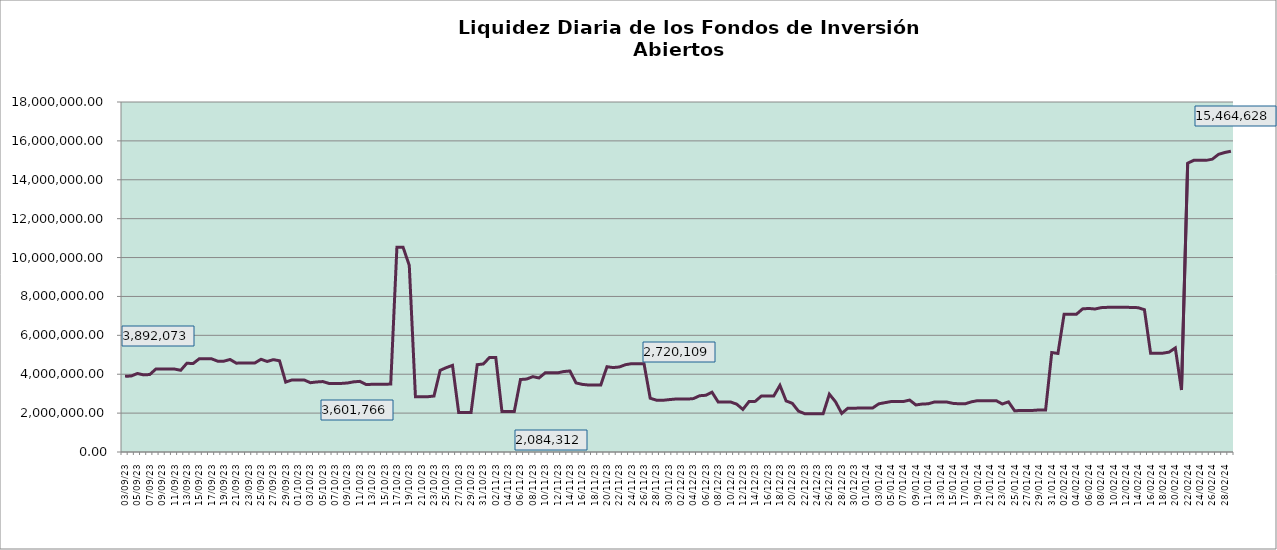
| Category | Liquidez |
|---|---|
| 2023-09-03 | 3892073.31 |
| 2023-09-04 | 3908903.28 |
| 2023-09-05 | 4036842.93 |
| 2023-09-06 | 3965911.15 |
| 2023-09-07 | 3984917.66 |
| 2023-09-08 | 4271911.78 |
| 2023-09-09 | 4271598.63 |
| 2023-09-10 | 4271285.58 |
| 2023-09-11 | 4265619.54 |
| 2023-09-12 | 4201445.83 |
| 2023-09-13 | 4564803.62 |
| 2023-09-14 | 4547943.86 |
| 2023-09-15 | 4793327.23 |
| 2023-09-16 | 4792917.57 |
| 2023-09-17 | 4792507.95 |
| 2023-09-18 | 4670390.41 |
| 2023-09-19 | 4672628.79 |
| 2023-09-20 | 4757974.91 |
| 2023-09-21 | 4568679.81 |
| 2023-09-22 | 4578069.45 |
| 2023-09-23 | 4577678.42 |
| 2023-09-24 | 4577287.46 |
| 2023-09-25 | 4768442.27 |
| 2023-09-26 | 4656041.24 |
| 2023-09-27 | 4749440.99 |
| 2023-09-28 | 4691215.04 |
| 2023-09-29 | 3594829.12 |
| 2023-09-30 | 3705131.39 |
| 2023-10-01 | 3704830.2 |
| 2023-10-02 | 3702299.07 |
| 2023-10-03 | 3563604.91 |
| 2023-10-04 | 3601766.17 |
| 2023-10-05 | 3622522.29 |
| 2023-10-06 | 3527179.42 |
| 2023-10-07 | 3526892.83 |
| 2023-10-08 | 3526606.27 |
| 2023-10-09 | 3549867.98 |
| 2023-10-10 | 3607916.07 |
| 2023-10-11 | 3632777.48 |
| 2023-10-12 | 3470821.4 |
| 2023-10-13 | 3480438.7 |
| 2023-10-14 | 3480170.23 |
| 2023-10-15 | 3479901.75 |
| 2023-10-16 | 3496944.65 |
| 2023-10-17 | 10529377.51 |
| 2023-10-18 | 10527427.59 |
| 2023-10-19 | 9598279.41 |
| 2023-10-20 | 2843795.49 |
| 2023-10-21 | 2843576.21 |
| 2023-10-22 | 2843356.97 |
| 2023-10-23 | 2877543.06 |
| 2023-10-24 | 4199796.46 |
| 2023-10-25 | 4339276.81 |
| 2023-10-26 | 4455991.46 |
| 2023-10-27 | 2029862.19 |
| 2023-10-28 | 2029705.75 |
| 2023-10-29 | 2029549.34 |
| 2023-10-30 | 4491312.09 |
| 2023-10-31 | 4528124.94 |
| 2023-11-01 | 4866315.82 |
| 2023-11-02 | 4865940.97 |
| 2023-11-03 | 2084311.74 |
| 2023-11-04 | 2084151.19 |
| 2023-11-05 | 2083990.68 |
| 2023-11-06 | 3727221.54 |
| 2023-11-07 | 3752037.55 |
| 2023-11-08 | 3875044.89 |
| 2023-11-09 | 3807636.9 |
| 2023-11-10 | 4070553.01 |
| 2023-11-11 | 4070322.09 |
| 2023-11-12 | 4070091.24 |
| 2023-11-13 | 4137469.64 |
| 2023-11-14 | 4166581.56 |
| 2023-11-15 | 3552454.63 |
| 2023-11-16 | 3478407.46 |
| 2023-11-17 | 3445309.06 |
| 2023-11-18 | 3445113.71 |
| 2023-11-19 | 3444918.35 |
| 2023-11-20 | 4386196.81 |
| 2023-11-21 | 4342385.83 |
| 2023-11-22 | 4372626.66 |
| 2023-11-23 | 4489820.31 |
| 2023-11-24 | 4544220.56 |
| 2023-11-25 | 4543962.98 |
| 2023-11-26 | 4543705.44 |
| 2023-11-27 | 2766288.53 |
| 2023-11-28 | 2665717.08 |
| 2023-11-29 | 2656380.27 |
| 2023-11-30 | 2691860.79 |
| 2023-12-01 | 2720262.81 |
| 2023-12-02 | 2720108.68 |
| 2023-12-03 | 2719954.59 |
| 2023-12-04 | 2746705.4 |
| 2023-12-05 | 2894133.5 |
| 2023-12-06 | 2916814.53 |
| 2023-12-07 | 3077187.61 |
| 2023-12-08 | 2573849.69 |
| 2023-12-09 | 2573703.91 |
| 2023-12-10 | 2573558.18 |
| 2023-12-11 | 2461459.62 |
| 2023-12-12 | 2190702.84 |
| 2023-12-13 | 2593963.56 |
| 2023-12-14 | 2603847 |
| 2023-12-15 | 2880624.68 |
| 2023-12-16 | 2880496.53 |
| 2023-12-17 | 2880368.4 |
| 2023-12-18 | 3427569.02 |
| 2023-12-19 | 2626945.09 |
| 2023-12-20 | 2503393.87 |
| 2023-12-21 | 2102165.32 |
| 2023-12-22 | 1971821.96 |
| 2023-12-23 | 1971734.3 |
| 2023-12-24 | 1971646.63 |
| 2023-12-25 | 1971558.94 |
| 2023-12-26 | 2974522.85 |
| 2023-12-27 | 2581700.12 |
| 2023-12-28 | 1984714.53 |
| 2023-12-29 | 2254994.88 |
| 2023-12-30 | 2254894.64 |
| 2023-12-31 | 2258082.15 |
| 2024-01-01 | 2257981.74 |
| 2024-01-02 | 2260561.99 |
| 2024-01-03 | 2476883.36 |
| 2024-01-04 | 2537478.87 |
| 2024-01-05 | 2594369.41 |
| 2024-01-06 | 2597486.32 |
| 2024-01-07 | 2597370.86 |
| 2024-01-08 | 2670959.38 |
| 2024-01-09 | 2420194.27 |
| 2024-01-10 | 2464449.75 |
| 2024-01-11 | 2479715.02 |
| 2024-01-12 | 2570593.12 |
| 2024-01-13 | 2570447.79 |
| 2024-01-14 | 2570302.43 |
| 2024-01-15 | 2501292.9 |
| 2024-01-16 | 2479569.79 |
| 2024-01-17 | 2480836.22 |
| 2024-01-18 | 2580722.87 |
| 2024-01-19 | 2641102.41 |
| 2024-01-20 | 2640953.13 |
| 2024-01-21 | 2640803.88 |
| 2024-01-22 | 2641058.29 |
| 2024-01-23 | 2469288.05 |
| 2024-01-24 | 2576946.84 |
| 2024-01-25 | 2116401.3 |
| 2024-01-26 | 2140122.93 |
| 2024-01-27 | 2140002.04 |
| 2024-01-28 | 2139881.12 |
| 2024-01-29 | 2162716.43 |
| 2024-01-30 | 2155182.85 |
| 2024-01-31 | 5115356.31 |
| 2024-02-01 | 5068381.51 |
| 2024-02-02 | 7086667.34 |
| 2024-02-03 | 7087448.74 |
| 2024-02-04 | 7087019.89 |
| 2024-02-05 | 7361148.6 |
| 2024-02-06 | 7382154.33 |
| 2024-02-07 | 7354170.53 |
| 2024-02-08 | 7423842 |
| 2024-02-09 | 7439013.89 |
| 2024-02-10 | 7438805.86 |
| 2024-02-11 | 7438415.97 |
| 2024-02-12 | 7438026.09 |
| 2024-02-13 | 7437636.25 |
| 2024-02-14 | 7420798.46 |
| 2024-02-15 | 7318115.93 |
| 2024-02-16 | 5082856.77 |
| 2024-02-17 | 5082590.41 |
| 2024-02-18 | 5082324.11 |
| 2024-02-19 | 5137479.12 |
| 2024-02-20 | 5351174.43 |
| 2024-02-21 | 3186014.06 |
| 2024-02-22 | 14855775.27 |
| 2024-02-23 | 14999230.84 |
| 2024-02-24 | 14999049.57 |
| 2024-02-25 | 14998263.95 |
| 2024-02-26 | 15058046.36 |
| 2024-02-27 | 15303460.28 |
| 2024-02-28 | 15399459.46 |
| 2024-02-29 | 15464628.31 |